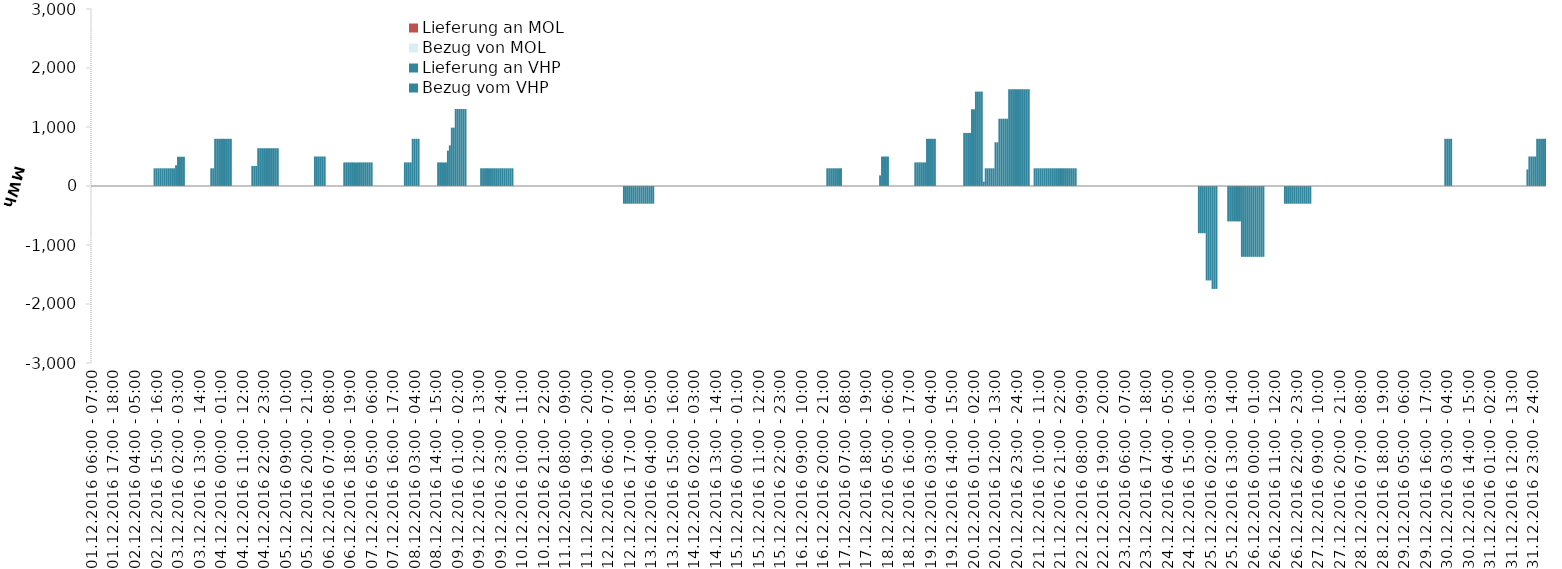
| Category | Bezug vom VHP | Lieferung an VHP | Bezug von MOL | Lieferung an MOL |
|---|---|---|---|---|
| 01.12.2016 06:00 - 07:00 | 0 | 0 | 0 | 0 |
| 01.12.2016 07:00 - 08:00 | 0 | 0 | 0 | 0 |
| 01.12.2016 08:00 - 09:00 | 0 | 0 | 0 | 0 |
| 01.12.2016 09:00 - 10:00 | 0 | 0 | 0 | 0 |
| 01.12.2016 10:00 - 11:00 | 0 | 0 | 0 | 0 |
| 01.12.2016 11:00 - 12:00 | 0 | 0 | 0 | 0 |
| 01.12.2016 12:00 - 13:00 | 0 | 0 | 0 | 0 |
| 01.12.2016 13:00 - 14:00 | 0 | 0 | 0 | 0 |
| 01.12.2016 14:00 - 15:00 | 0 | 0 | 0 | 0 |
| 01.12.2016 15:00 - 16:00 | 0 | 0 | 0 | 0 |
| 01.12.2016 16:00 - 17:00 | 0 | 0 | 0 | 0 |
| 01.12.2016 17:00 - 18:00 | 0 | 0 | 0 | 0 |
| 01.12.2016 18:00 - 19:00 | 0 | 0 | 0 | 0 |
| 01.12.2016 19:00 - 20:00 | 0 | 0 | 0 | 0 |
| 01.12.2016 20:00 - 21:00 | 0 | 0 | 0 | 0 |
| 01.12.2016 21:00 - 22:00 | 0 | 0 | 0 | 0 |
| 01.12.2016 22:00 - 23:00 | 0 | 0 | 0 | 0 |
| 01.12.2016 23:00 - 24:00 | 0 | 0 | 0 | 0 |
| 02.12.2016 00:00 - 01:00 | 0 | 0 | 0 | 0 |
| 02.12.2016 01:00 - 02:00 | 0 | 0 | 0 | 0 |
| 02.12.2016 02:00 - 03:00 | 0 | 0 | 0 | 0 |
| 02.12.2016 03:00 - 04:00 | 0 | 0 | 0 | 0 |
| 02.12.2016 04:00 - 05:00 | 0 | 0 | 0 | 0 |
| 02.12.2016 05:00 - 06:00 | 0 | 0 | 0 | 0 |
| 02.12.2016 06:00 - 07:00 | 0 | 0 | 0 | 0 |
| 02.12.2016 07:00 - 08:00 | 0 | 0 | 0 | 0 |
| 02.12.2016 08:00 - 09:00 | 0 | 0 | 0 | 0 |
| 02.12.2016 09:00 - 10:00 | 0 | 0 | 0 | 0 |
| 02.12.2016 10:00 - 11:00 | 0 | 0 | 0 | 0 |
| 02.12.2016 11:00 - 12:00 | 0 | 0 | 0 | 0 |
| 02.12.2016 12:00 - 13:00 | 0 | 0 | 0 | 0 |
| 02.12.2016 13:00 - 14:00 | 0 | 0 | 0 | 0 |
| 02.12.2016 14:00 - 15:00 | 300 | 0 | 0 | 0 |
| 02.12.2016 15:00 - 16:00 | 300 | 0 | 0 | 0 |
| 02.12.2016 16:00 - 17:00 | 300 | 0 | 0 | 0 |
| 02.12.2016 17:00 - 18:00 | 300 | 0 | 0 | 0 |
| 02.12.2016 18:00 - 19:00 | 300 | 0 | 0 | 0 |
| 02.12.2016 19:00 - 20:00 | 300 | 0 | 0 | 0 |
| 02.12.2016 20:00 - 21:00 | 300 | 0 | 0 | 0 |
| 02.12.2016 21:00 - 22:00 | 300 | 0 | 0 | 0 |
| 02.12.2016 22:00 - 23:00 | 300 | 0 | 0 | 0 |
| 02.12.2016 23:00 - 24:00 | 300 | 0 | 0 | 0 |
| 03.12.2016 00:00 - 01:00 | 300 | 0 | 0 | 0 |
| 03.12.2016 01:00 - 02:00 | 352 | 0 | 0 | 0 |
| 03.12.2016 02:00 - 03:00 | 496 | 0 | 0 | 0 |
| 03.12.2016 03:00 - 04:00 | 496 | 0 | 0 | 0 |
| 03.12.2016 04:00 - 05:00 | 496 | 0 | 0 | 0 |
| 03.12.2016 05:00 - 06:00 | 496 | 0 | 0 | 0 |
| 03.12.2016 06:00 - 07:00 | 0 | 0 | 0 | 0 |
| 03.12.2016 07:00 - 08:00 | 0 | 0 | 0 | 0 |
| 03.12.2016 08:00 - 09:00 | 0 | 0 | 0 | 0 |
| 03.12.2016 09:00 - 10:00 | 0 | 0 | 0 | 0 |
| 03.12.2016 10:00 - 11:00 | 0 | 0 | 0 | 0 |
| 03.12.2016 11:00 - 12:00 | 0 | 0 | 0 | 0 |
| 03.12.2016 12:00 - 13:00 | 0 | 0 | 0 | 0 |
| 03.12.2016 13:00 - 14:00 | 0 | 0 | 0 | 0 |
| 03.12.2016 14:00 - 15:00 | 0 | 0 | 0 | 0 |
| 03.12.2016 15:00 - 16:00 | 0 | 0 | 0 | 0 |
| 03.12.2016 16:00 - 17:00 | 0 | 0 | 0 | 0 |
| 03.12.2016 17:00 - 18:00 | 0 | 0 | 0 | 0 |
| 03.12.2016 18:00 - 19:00 | 0 | 0 | 0 | 0 |
| 03.12.2016 19:00 - 20:00 | 300 | 0 | 0 | 0 |
| 03.12.2016 20:00 - 21:00 | 300 | 0 | 0 | 0 |
| 03.12.2016 21:00 - 22:00 | 800 | 0 | 0 | 0 |
| 03.12.2016 22:00 - 23:00 | 800 | 0 | 0 | 0 |
| 03.12.2016 23:00 - 24:00 | 800 | 0 | 0 | 0 |
| 04.12.2016 00:00 - 01:00 | 800 | 0 | 0 | 0 |
| 04.12.2016 01:00 - 02:00 | 800 | 0 | 0 | 0 |
| 04.12.2016 02:00 - 03:00 | 800 | 0 | 0 | 0 |
| 04.12.2016 03:00 - 04:00 | 800 | 0 | 0 | 0 |
| 04.12.2016 04:00 - 05:00 | 800 | 0 | 0 | 0 |
| 04.12.2016 05:00 - 06:00 | 800 | 0 | 0 | 0 |
| 04.12.2016 06:00 - 07:00 | 0 | 0 | 0 | 0 |
| 04.12.2016 07:00 - 08:00 | 0 | 0 | 0 | 0 |
| 04.12.2016 08:00 - 09:00 | 0 | 0 | 0 | 0 |
| 04.12.2016 09:00 - 10:00 | 0 | 0 | 0 | 0 |
| 04.12.2016 10:00 - 11:00 | 0 | 0 | 0 | 0 |
| 04.12.2016 11:00 - 12:00 | 0 | 0 | 0 | 0 |
| 04.12.2016 12:00 - 13:00 | 0 | 0 | 0 | 0 |
| 04.12.2016 13:00 - 14:00 | 0 | 0 | 0 | 0 |
| 04.12.2016 14:00 - 15:00 | 0 | 0 | 0 | 0 |
| 04.12.2016 15:00 - 16:00 | 0 | 0 | 0 | 0 |
| 04.12.2016 16:00 - 17:00 | 340 | 0 | 0 | 0 |
| 04.12.2016 17:00 - 18:00 | 340 | 0 | 0 | 0 |
| 04.12.2016 18:00 - 19:00 | 340 | 0 | 0 | 0 |
| 04.12.2016 19:00 - 20:00 | 640 | 0 | 0 | 0 |
| 04.12.2016 20:00 - 21:00 | 640 | 0 | 0 | 0 |
| 04.12.2016 21:00 - 22:00 | 640 | 0 | 0 | 0 |
| 04.12.2016 22:00 - 23:00 | 640 | 0 | 0 | 0 |
| 04.12.2016 23:00 - 24:00 | 640 | 0 | 0 | 0 |
| 05.12.2016 00:00 - 01:00 | 640 | 0 | 0 | 0 |
| 05.12.2016 01:00 - 02:00 | 640 | 0 | 0 | 0 |
| 05.12.2016 02:00 - 03:00 | 640 | 0 | 0 | 0 |
| 05.12.2016 03:00 - 04:00 | 640 | 0 | 0 | 0 |
| 05.12.2016 04:00 - 05:00 | 640 | 0 | 0 | 0 |
| 05.12.2016 05:00 - 06:00 | 640 | 0 | 0 | 0 |
| 05.12.2016 06:00 - 07:00 | 0 | 0 | 0 | 0 |
| 05.12.2016 07:00 - 08:00 | 0 | 0 | 0 | 0 |
| 05.12.2016 08:00 - 09:00 | 0 | 0 | 0 | 0 |
| 05.12.2016 09:00 - 10:00 | 0 | 0 | 0 | 0 |
| 05.12.2016 10:00 - 11:00 | 0 | 0 | 0 | 0 |
| 05.12.2016 11:00 - 12:00 | 0 | 0 | 0 | 0 |
| 05.12.2016 12:00 - 13:00 | 0 | 0 | 0 | 0 |
| 05.12.2016 13:00 - 14:00 | 0 | 0 | 0 | 0 |
| 05.12.2016 14:00 - 15:00 | 0 | 0 | 0 | 0 |
| 05.12.2016 15:00 - 16:00 | 0 | 0 | 0 | 0 |
| 05.12.2016 16:00 - 17:00 | 0 | 0 | 0 | 0 |
| 05.12.2016 17:00 - 18:00 | 0 | 0 | 0 | 0 |
| 05.12.2016 18:00 - 19:00 | 0 | 0 | 0 | 0 |
| 05.12.2016 19:00 - 20:00 | 0 | 0 | 0 | 0 |
| 05.12.2016 20:00 - 21:00 | 0 | 0 | 0 | 0 |
| 05.12.2016 21:00 - 22:00 | 0 | 0 | 0 | 0 |
| 05.12.2016 22:00 - 23:00 | 0 | 0 | 0 | 0 |
| 05.12.2016 23:00 - 24:00 | 0 | 0 | 0 | 0 |
| 06.12.2016 00:00 - 01:00 | 500 | 0 | 0 | 0 |
| 06.12.2016 01:00 - 02:00 | 500 | 0 | 0 | 0 |
| 06.12.2016 02:00 - 03:00 | 500 | 0 | 0 | 0 |
| 06.12.2016 03:00 - 04:00 | 500 | 0 | 0 | 0 |
| 06.12.2016 04:00 - 05:00 | 500 | 0 | 0 | 0 |
| 06.12.2016 05:00 - 06:00 | 500 | 0 | 0 | 0 |
| 06.12.2016 06:00 - 07:00 | 0 | 0 | 0 | 0 |
| 06.12.2016 07:00 - 08:00 | 0 | 0 | 0 | 0 |
| 06.12.2016 08:00 - 09:00 | 0 | 0 | 0 | 0 |
| 06.12.2016 09:00 - 10:00 | 0 | 0 | 0 | 0 |
| 06.12.2016 10:00 - 11:00 | 0 | 0 | 0 | 0 |
| 06.12.2016 11:00 - 12:00 | 0 | 0 | 0 | 0 |
| 06.12.2016 12:00 - 13:00 | 0 | 0 | 0 | 0 |
| 06.12.2016 13:00 - 14:00 | 0 | 0 | 0 | 0 |
| 06.12.2016 14:00 - 15:00 | 0 | 0 | 0 | 0 |
| 06.12.2016 15:00 - 16:00 | 400 | 0 | 0 | 0 |
| 06.12.2016 16:00 - 17:00 | 400 | 0 | 0 | 0 |
| 06.12.2016 17:00 - 18:00 | 400 | 0 | 0 | 0 |
| 06.12.2016 18:00 - 19:00 | 400 | 0 | 0 | 0 |
| 06.12.2016 19:00 - 20:00 | 400 | 0 | 0 | 0 |
| 06.12.2016 20:00 - 21:00 | 400 | 0 | 0 | 0 |
| 06.12.2016 21:00 - 22:00 | 400 | 0 | 0 | 0 |
| 06.12.2016 22:00 - 23:00 | 400 | 0 | 0 | 0 |
| 06.12.2016 23:00 - 24:00 | 400 | 0 | 0 | 0 |
| 07.12.2016 00:00 - 01:00 | 400 | 0 | 0 | 0 |
| 07.12.2016 01:00 - 02:00 | 400 | 0 | 0 | 0 |
| 07.12.2016 02:00 - 03:00 | 400 | 0 | 0 | 0 |
| 07.12.2016 03:00 - 04:00 | 400 | 0 | 0 | 0 |
| 07.12.2016 04:00 - 05:00 | 400 | 0 | 0 | 0 |
| 07.12.2016 05:00 - 06:00 | 400 | 0 | 0 | 0 |
| 07.12.2016 06:00 - 07:00 | 0 | 0 | 0 | 0 |
| 07.12.2016 07:00 - 08:00 | 0 | 0 | 0 | 0 |
| 07.12.2016 08:00 - 09:00 | 0 | 0 | 0 | 0 |
| 07.12.2016 09:00 - 10:00 | 0 | 0 | 0 | 0 |
| 07.12.2016 10:00 - 11:00 | 0 | 0 | 0 | 0 |
| 07.12.2016 11:00 - 12:00 | 0 | 0 | 0 | 0 |
| 07.12.2016 12:00 - 13:00 | 0 | 0 | 0 | 0 |
| 07.12.2016 13:00 - 14:00 | 0 | 0 | 0 | 0 |
| 07.12.2016 14:00 - 15:00 | 0 | 0 | 0 | 0 |
| 07.12.2016 15:00 - 16:00 | 0 | 0 | 0 | 0 |
| 07.12.2016 16:00 - 17:00 | 0 | 0 | 0 | 0 |
| 07.12.2016 17:00 - 18:00 | 0 | 0 | 0 | 0 |
| 07.12.2016 18:00 - 19:00 | 0 | 0 | 0 | 0 |
| 07.12.2016 19:00 - 20:00 | 0 | 0 | 0 | 0 |
| 07.12.2016 20:00 - 21:00 | 0 | 0 | 0 | 0 |
| 07.12.2016 21:00 - 22:00 | 0 | 0 | 0 | 0 |
| 07.12.2016 22:00 - 23:00 | 400 | 0 | 0 | 0 |
| 07.12.2016 23:00 - 24:00 | 400 | 0 | 0 | 0 |
| 08.12.2016 00:00 - 01:00 | 400 | 0 | 0 | 0 |
| 08.12.2016 01:00 - 02:00 | 400 | 0 | 0 | 0 |
| 08.12.2016 02:00 - 03:00 | 800 | 0 | 0 | 0 |
| 08.12.2016 03:00 - 04:00 | 800 | 0 | 0 | 0 |
| 08.12.2016 04:00 - 05:00 | 800 | 0 | 0 | 0 |
| 08.12.2016 05:00 - 06:00 | 800 | 0 | 0 | 0 |
| 08.12.2016 06:00 - 07:00 | 0 | 0 | 0 | 0 |
| 08.12.2016 07:00 - 08:00 | 0 | 0 | 0 | 0 |
| 08.12.2016 08:00 - 09:00 | 0 | 0 | 0 | 0 |
| 08.12.2016 09:00 - 10:00 | 0 | 0 | 0 | 0 |
| 08.12.2016 10:00 - 11:00 | 0 | 0 | 0 | 0 |
| 08.12.2016 11:00 - 12:00 | 0 | 0 | 0 | 0 |
| 08.12.2016 12:00 - 13:00 | 0 | 0 | 0 | 0 |
| 08.12.2016 13:00 - 14:00 | 0 | 0 | 0 | 0 |
| 08.12.2016 14:00 - 15:00 | 0 | 0 | 0 | 0 |
| 08.12.2016 15:00 - 16:00 | 400 | 0 | 0 | 0 |
| 08.12.2016 16:00 - 17:00 | 400 | 0 | 0 | 0 |
| 08.12.2016 17:00 - 18:00 | 400 | 0 | 0 | 0 |
| 08.12.2016 18:00 - 19:00 | 400 | 0 | 0 | 0 |
| 08.12.2016 19:00 - 20:00 | 400 | 0 | 0 | 0 |
| 08.12.2016 20:00 - 21:00 | 600 | 0 | 0 | 0 |
| 08.12.2016 21:00 - 22:00 | 689 | 0 | 0 | 0 |
| 08.12.2016 22:00 - 23:00 | 989 | 0 | 0 | 0 |
| 08.12.2016 23:00 - 24:00 | 989 | 0 | 0 | 0 |
| 09.12.2016 00:00 - 01:00 | 1306 | 0 | 0 | 0 |
| 09.12.2016 01:00 - 02:00 | 1306 | 0 | 0 | 0 |
| 09.12.2016 02:00 - 03:00 | 1306 | 0 | 0 | 0 |
| 09.12.2016 03:00 - 04:00 | 1306 | 0 | 0 | 0 |
| 09.12.2016 04:00 - 05:00 | 1306 | 0 | 0 | 0 |
| 09.12.2016 05:00 - 06:00 | 1306 | 0 | 0 | 0 |
| 09.12.2016 06:00 - 07:00 | 0 | 0 | 0 | 0 |
| 09.12.2016 07:00 - 08:00 | 0 | 0 | 0 | 0 |
| 09.12.2016 08:00 - 09:00 | 0 | 0 | 0 | 0 |
| 09.12.2016 09:00 - 10:00 | 0 | 0 | 0 | 0 |
| 09.12.2016 10:00 - 11:00 | 0 | 0 | 0 | 0 |
| 09.12.2016 11:00 - 12:00 | 0 | 0 | 0 | 0 |
| 09.12.2016 12:00 - 13:00 | 0 | 0 | 0 | 0 |
| 09.12.2016 13:00 - 14:00 | 300 | 0 | 0 | 0 |
| 09.12.2016 14:00 - 15:00 | 300 | 0 | 0 | 0 |
| 09.12.2016 15:00 - 16:00 | 300 | 0 | 0 | 0 |
| 09.12.2016 16:00 - 17:00 | 300 | 0 | 0 | 0 |
| 09.12.2016 17:00 - 18:00 | 300 | 0 | 0 | 0 |
| 09.12.2016 18:00 - 19:00 | 300 | 0 | 0 | 0 |
| 09.12.2016 19:00 - 20:00 | 300 | 0 | 0 | 0 |
| 09.12.2016 20:00 - 21:00 | 300 | 0 | 0 | 0 |
| 09.12.2016 21:00 - 22:00 | 300 | 0 | 0 | 0 |
| 09.12.2016 22:00 - 23:00 | 300 | 0 | 0 | 0 |
| 09.12.2016 23:00 - 24:00 | 300 | 0 | 0 | 0 |
| 10.12.2016 00:00 - 01:00 | 300 | 0 | 0 | 0 |
| 10.12.2016 01:00 - 02:00 | 300 | 0 | 0 | 0 |
| 10.12.2016 02:00 - 03:00 | 300 | 0 | 0 | 0 |
| 10.12.2016 03:00 - 04:00 | 300 | 0 | 0 | 0 |
| 10.12.2016 04:00 - 05:00 | 300 | 0 | 0 | 0 |
| 10.12.2016 05:00 - 06:00 | 300 | 0 | 0 | 0 |
| 10.12.2016 06:00 - 07:00 | 0 | 0 | 0 | 0 |
| 10.12.2016 07:00 - 08:00 | 0 | 0 | 0 | 0 |
| 10.12.2016 08:00 - 09:00 | 0 | 0 | 0 | 0 |
| 10.12.2016 09:00 - 10:00 | 0 | 0 | 0 | 0 |
| 10.12.2016 10:00 - 11:00 | 0 | 0 | 0 | 0 |
| 10.12.2016 11:00 - 12:00 | 0 | 0 | 0 | 0 |
| 10.12.2016 12:00 - 13:00 | 0 | 0 | 0 | 0 |
| 10.12.2016 13:00 - 14:00 | 0 | 0 | 0 | 0 |
| 10.12.2016 14:00 - 15:00 | 0 | 0 | 0 | 0 |
| 10.12.2016 15:00 - 16:00 | 0 | 0 | 0 | 0 |
| 10.12.2016 16:00 - 17:00 | 0 | 0 | 0 | 0 |
| 10.12.2016 17:00 - 18:00 | 0 | 0 | 0 | 0 |
| 10.12.2016 18:00 - 19:00 | 0 | 0 | 0 | 0 |
| 10.12.2016 19:00 - 20:00 | 0 | 0 | 0 | 0 |
| 10.12.2016 20:00 - 21:00 | 0 | 0 | 0 | 0 |
| 10.12.2016 21:00 - 22:00 | 0 | 0 | 0 | 0 |
| 10.12.2016 22:00 - 23:00 | 0 | 0 | 0 | 0 |
| 10.12.2016 23:00 - 24:00 | 0 | 0 | 0 | 0 |
| 11.12.2016 00:00 - 01:00 | 0 | 0 | 0 | 0 |
| 11.12.2016 01:00 - 02:00 | 0 | 0 | 0 | 0 |
| 11.12.2016 02:00 - 03:00 | 0 | 0 | 0 | 0 |
| 11.12.2016 03:00 - 04:00 | 0 | 0 | 0 | 0 |
| 11.12.2016 04:00 - 05:00 | 0 | 0 | 0 | 0 |
| 11.12.2016 05:00 - 06:00 | 0 | 0 | 0 | 0 |
| 11.12.2016 06:00 - 07:00 | 0 | 0 | 0 | 0 |
| 11.12.2016 07:00 - 08:00 | 0 | 0 | 0 | 0 |
| 11.12.2016 08:00 - 09:00 | 0 | 0 | 0 | 0 |
| 11.12.2016 09:00 - 10:00 | 0 | 0 | 0 | 0 |
| 11.12.2016 10:00 - 11:00 | 0 | 0 | 0 | 0 |
| 11.12.2016 11:00 - 12:00 | 0 | 0 | 0 | 0 |
| 11.12.2016 12:00 - 13:00 | 0 | 0 | 0 | 0 |
| 11.12.2016 13:00 - 14:00 | 0 | 0 | 0 | 0 |
| 11.12.2016 14:00 - 15:00 | 0 | 0 | 0 | 0 |
| 11.12.2016 15:00 - 16:00 | 0 | 0 | 0 | 0 |
| 11.12.2016 16:00 - 17:00 | 0 | 0 | 0 | 0 |
| 11.12.2016 17:00 - 18:00 | 0 | 0 | 0 | 0 |
| 11.12.2016 18:00 - 19:00 | 0 | 0 | 0 | 0 |
| 11.12.2016 19:00 - 20:00 | 0 | 0 | 0 | 0 |
| 11.12.2016 20:00 - 21:00 | 0 | 0 | 0 | 0 |
| 11.12.2016 21:00 - 22:00 | 0 | 0 | 0 | 0 |
| 11.12.2016 22:00 - 23:00 | 0 | 0 | 0 | 0 |
| 11.12.2016 23:00 - 24:00 | 0 | 0 | 0 | 0 |
| 12.12.2016 00:00 - 01:00 | 0 | 0 | 0 | 0 |
| 12.12.2016 01:00 - 02:00 | 0 | 0 | 0 | 0 |
| 12.12.2016 02:00 - 03:00 | 0 | 0 | 0 | 0 |
| 12.12.2016 03:00 - 04:00 | 0 | 0 | 0 | 0 |
| 12.12.2016 04:00 - 05:00 | 0 | 0 | 0 | 0 |
| 12.12.2016 05:00 - 06:00 | 0 | 0 | 0 | 0 |
| 12.12.2016 06:00 - 07:00 | 0 | 0 | 0 | 0 |
| 12.12.2016 07:00 - 08:00 | 0 | 0 | 0 | 0 |
| 12.12.2016 08:00 - 09:00 | 0 | 0 | 0 | 0 |
| 12.12.2016 09:00 - 10:00 | 0 | 0 | 0 | 0 |
| 12.12.2016 10:00 - 11:00 | 0 | 0 | 0 | 0 |
| 12.12.2016 11:00 - 12:00 | 0 | 0 | 0 | 0 |
| 12.12.2016 12:00 - 13:00 | 0 | 0 | 0 | 0 |
| 12.12.2016 13:00 - 14:00 | 0 | 0 | 0 | 0 |
| 12.12.2016 14:00 - 15:00 | 0 | -300 | 0 | 0 |
| 12.12.2016 15:00 - 16:00 | 0 | -300 | 0 | 0 |
| 12.12.2016 16:00 - 17:00 | 0 | -300 | 0 | 0 |
| 12.12.2016 17:00 - 18:00 | 0 | -300 | 0 | 0 |
| 12.12.2016 18:00 - 19:00 | 0 | -300 | 0 | 0 |
| 12.12.2016 19:00 - 20:00 | 0 | -300 | 0 | 0 |
| 12.12.2016 20:00 - 21:00 | 0 | -300 | 0 | 0 |
| 12.12.2016 21:00 - 22:00 | 0 | -300 | 0 | 0 |
| 12.12.2016 22:00 - 23:00 | 0 | -300 | 0 | 0 |
| 12.12.2016 23:00 - 24:00 | 0 | -300 | 0 | 0 |
| 13.12.2016 00:00 - 01:00 | 0 | -300 | 0 | 0 |
| 13.12.2016 01:00 - 02:00 | 0 | -300 | 0 | 0 |
| 13.12.2016 02:00 - 03:00 | 0 | -300 | 0 | 0 |
| 13.12.2016 03:00 - 04:00 | 0 | -300 | 0 | 0 |
| 13.12.2016 04:00 - 05:00 | 0 | -300 | 0 | 0 |
| 13.12.2016 05:00 - 06:00 | 0 | -300 | 0 | 0 |
| 13.12.2016 06:00 - 07:00 | 0 | 0 | 0 | 0 |
| 13.12.2016 07:00 - 08:00 | 0 | 0 | 0 | 0 |
| 13.12.2016 08:00 - 09:00 | 0 | 0 | 0 | 0 |
| 13.12.2016 09:00 - 10:00 | 0 | 0 | 0 | 0 |
| 13.12.2016 10:00 - 11:00 | 0 | 0 | 0 | 0 |
| 13.12.2016 11:00 - 12:00 | 0 | 0 | 0 | 0 |
| 13.12.2016 12:00 - 13:00 | 0 | 0 | 0 | 0 |
| 13.12.2016 13:00 - 14:00 | 0 | 0 | 0 | 0 |
| 13.12.2016 14:00 - 15:00 | 0 | 0 | 0 | 0 |
| 13.12.2016 15:00 - 16:00 | 0 | 0 | 0 | 0 |
| 13.12.2016 16:00 - 17:00 | 0 | 0 | 0 | 0 |
| 13.12.2016 17:00 - 18:00 | 0 | 0 | 0 | 0 |
| 13.12.2016 18:00 - 19:00 | 0 | 0 | 0 | 0 |
| 13.12.2016 19:00 - 20:00 | 0 | 0 | 0 | 0 |
| 13.12.2016 20:00 - 21:00 | 0 | 0 | 0 | 0 |
| 13.12.2016 21:00 - 22:00 | 0 | 0 | 0 | 0 |
| 13.12.2016 22:00 - 23:00 | 0 | 0 | 0 | 0 |
| 13.12.2016 23:00 - 24:00 | 0 | 0 | 0 | 0 |
| 14.12.2016 00:00 - 01:00 | 0 | 0 | 0 | 0 |
| 14.12.2016 01:00 - 02:00 | 0 | 0 | 0 | 0 |
| 14.12.2016 02:00 - 03:00 | 0 | 0 | 0 | 0 |
| 14.12.2016 03:00 - 04:00 | 0 | 0 | 0 | 0 |
| 14.12.2016 04:00 - 05:00 | 0 | 0 | 0 | 0 |
| 14.12.2016 05:00 - 06:00 | 0 | 0 | 0 | 0 |
| 14.12.2016 06:00 - 07:00 | 0 | 0 | 0 | 0 |
| 14.12.2016 07:00 - 08:00 | 0 | 0 | 0 | 0 |
| 14.12.2016 08:00 - 09:00 | 0 | 0 | 0 | 0 |
| 14.12.2016 09:00 - 10:00 | 0 | 0 | 0 | 0 |
| 14.12.2016 10:00 - 11:00 | 0 | 0 | 0 | 0 |
| 14.12.2016 11:00 - 12:00 | 0 | 0 | 0 | 0 |
| 14.12.2016 12:00 - 13:00 | 0 | 0 | 0 | 0 |
| 14.12.2016 13:00 - 14:00 | 0 | 0 | 0 | 0 |
| 14.12.2016 14:00 - 15:00 | 0 | 0 | 0 | 0 |
| 14.12.2016 15:00 - 16:00 | 0 | 0 | 0 | 0 |
| 14.12.2016 16:00 - 17:00 | 0 | 0 | 0 | 0 |
| 14.12.2016 17:00 - 18:00 | 0 | 0 | 0 | 0 |
| 14.12.2016 18:00 - 19:00 | 0 | 0 | 0 | 0 |
| 14.12.2016 19:00 - 20:00 | 0 | 0 | 0 | 0 |
| 14.12.2016 20:00 - 21:00 | 0 | 0 | 0 | 0 |
| 14.12.2016 21:00 - 22:00 | 0 | 0 | 0 | 0 |
| 14.12.2016 22:00 - 23:00 | 0 | 0 | 0 | 0 |
| 14.12.2016 23:00 - 24:00 | 0 | 0 | 0 | 0 |
| 15.12.2016 00:00 - 01:00 | 0 | 0 | 0 | 0 |
| 15.12.2016 01:00 - 02:00 | 0 | 0 | 0 | 0 |
| 15.12.2016 02:00 - 03:00 | 0 | 0 | 0 | 0 |
| 15.12.2016 03:00 - 04:00 | 0 | 0 | 0 | 0 |
| 15.12.2016 04:00 - 05:00 | 0 | 0 | 0 | 0 |
| 15.12.2016 05:00 - 06:00 | 0 | 0 | 0 | 0 |
| 15.12.2016 06:00 - 07:00 | 0 | 0 | 0 | 0 |
| 15.12.2016 07:00 - 08:00 | 0 | 0 | 0 | 0 |
| 15.12.2016 08:00 - 09:00 | 0 | 0 | 0 | 0 |
| 15.12.2016 09:00 - 10:00 | 0 | 0 | 0 | 0 |
| 15.12.2016 10:00 - 11:00 | 0 | 0 | 0 | 0 |
| 15.12.2016 11:00 - 12:00 | 0 | 0 | 0 | 0 |
| 15.12.2016 12:00 - 13:00 | 0 | 0 | 0 | 0 |
| 15.12.2016 13:00 - 14:00 | 0 | 0 | 0 | 0 |
| 15.12.2016 14:00 - 15:00 | 0 | 0 | 0 | 0 |
| 15.12.2016 15:00 - 16:00 | 0 | 0 | 0 | 0 |
| 15.12.2016 16:00 - 17:00 | 0 | 0 | 0 | 0 |
| 15.12.2016 17:00 - 18:00 | 0 | 0 | 0 | 0 |
| 15.12.2016 18:00 - 19:00 | 0 | 0 | 0 | 0 |
| 15.12.2016 19:00 - 20:00 | 0 | 0 | 0 | 0 |
| 15.12.2016 20:00 - 21:00 | 0 | 0 | 0 | 0 |
| 15.12.2016 21:00 - 22:00 | 0 | 0 | 0 | 0 |
| 15.12.2016 22:00 - 23:00 | 0 | 0 | 0 | 0 |
| 15.12.2016 23:00 - 24:00 | 0 | 0 | 0 | 0 |
| 16.12.2016 00:00 - 01:00 | 0 | 0 | 0 | 0 |
| 16.12.2016 01:00 - 02:00 | 0 | 0 | 0 | 0 |
| 16.12.2016 02:00 - 03:00 | 0 | 0 | 0 | 0 |
| 16.12.2016 03:00 - 04:00 | 0 | 0 | 0 | 0 |
| 16.12.2016 04:00 - 05:00 | 0 | 0 | 0 | 0 |
| 16.12.2016 05:00 - 06:00 | 0 | 0 | 0 | 0 |
| 16.12.2016 06:00 - 07:00 | 0 | 0 | 0 | 0 |
| 16.12.2016 07:00 - 08:00 | 0 | 0 | 0 | 0 |
| 16.12.2016 08:00 - 09:00 | 0 | 0 | 0 | 0 |
| 16.12.2016 09:00 - 10:00 | 0 | 0 | 0 | 0 |
| 16.12.2016 10:00 - 11:00 | 0 | 0 | 0 | 0 |
| 16.12.2016 11:00 - 12:00 | 0 | 0 | 0 | 0 |
| 16.12.2016 12:00 - 13:00 | 0 | 0 | 0 | 0 |
| 16.12.2016 13:00 - 14:00 | 0 | 0 | 0 | 0 |
| 16.12.2016 14:00 - 15:00 | 0 | 0 | 0 | 0 |
| 16.12.2016 15:00 - 16:00 | 0 | 0 | 0 | 0 |
| 16.12.2016 16:00 - 17:00 | 0 | 0 | 0 | 0 |
| 16.12.2016 17:00 - 18:00 | 0 | 0 | 0 | 0 |
| 16.12.2016 18:00 - 19:00 | 0 | 0 | 0 | 0 |
| 16.12.2016 19:00 - 20:00 | 0 | 0 | 0 | 0 |
| 16.12.2016 20:00 - 21:00 | 0 | 0 | 0 | 0 |
| 16.12.2016 21:00 - 22:00 | 0 | 0 | 0 | 0 |
| 16.12.2016 22:00 - 23:00 | 300 | 0 | 0 | 0 |
| 16.12.2016 23:00 - 24:00 | 300 | 0 | 0 | 0 |
| 17.12.2016 00:00 - 01:00 | 300 | 0 | 0 | 0 |
| 17.12.2016 01:00 - 02:00 | 300 | 0 | 0 | 0 |
| 17.12.2016 02:00 - 03:00 | 300 | 0 | 0 | 0 |
| 17.12.2016 03:00 - 04:00 | 300 | 0 | 0 | 0 |
| 17.12.2016 04:00 - 05:00 | 300 | 0 | 0 | 0 |
| 17.12.2016 05:00 - 06:00 | 300 | 0 | 0 | 0 |
| 17.12.2016 06:00 - 07:00 | 0 | 0 | 0 | 0 |
| 17.12.2016 07:00 - 08:00 | 0 | 0 | 0 | 0 |
| 17.12.2016 08:00 - 09:00 | 0 | 0 | 0 | 0 |
| 17.12.2016 09:00 - 10:00 | 0 | 0 | 0 | 0 |
| 17.12.2016 10:00 - 11:00 | 0 | 0 | 0 | 0 |
| 17.12.2016 11:00 - 12:00 | 0 | 0 | 0 | 0 |
| 17.12.2016 12:00 - 13:00 | 0 | 0 | 0 | 0 |
| 17.12.2016 13:00 - 14:00 | 0 | 0 | 0 | 0 |
| 17.12.2016 14:00 - 15:00 | 0 | 0 | 0 | 0 |
| 17.12.2016 15:00 - 16:00 | 0 | 0 | 0 | 0 |
| 17.12.2016 16:00 - 17:00 | 0 | 0 | 0 | 0 |
| 17.12.2016 17:00 - 18:00 | 0 | 0 | 0 | 0 |
| 17.12.2016 18:00 - 19:00 | 0 | 0 | 0 | 0 |
| 17.12.2016 19:00 - 20:00 | 0 | 0 | 0 | 0 |
| 17.12.2016 20:00 - 21:00 | 0 | 0 | 0 | 0 |
| 17.12.2016 21:00 - 22:00 | 0 | 0 | 0 | 0 |
| 17.12.2016 22:00 - 23:00 | 0 | 0 | 0 | 0 |
| 17.12.2016 23:00 - 24:00 | 0 | 0 | 0 | 0 |
| 18.12.2016 00:00 - 01:00 | 0 | 0 | 0 | 0 |
| 18.12.2016 01:00 - 02:00 | 180 | 0 | 0 | 0 |
| 18.12.2016 02:00 - 03:00 | 500 | 0 | 0 | 0 |
| 18.12.2016 03:00 - 04:00 | 500 | 0 | 0 | 0 |
| 18.12.2016 04:00 - 05:00 | 500 | 0 | 0 | 0 |
| 18.12.2016 05:00 - 06:00 | 500 | 0 | 0 | 0 |
| 18.12.2016 06:00 - 07:00 | 0 | 0 | 0 | 0 |
| 18.12.2016 07:00 - 08:00 | 0 | 0 | 0 | 0 |
| 18.12.2016 08:00 - 09:00 | 0 | 0 | 0 | 0 |
| 18.12.2016 09:00 - 10:00 | 0 | 0 | 0 | 0 |
| 18.12.2016 10:00 - 11:00 | 0 | 0 | 0 | 0 |
| 18.12.2016 11:00 - 12:00 | 0 | 0 | 0 | 0 |
| 18.12.2016 12:00 - 13:00 | 0 | 0 | 0 | 0 |
| 18.12.2016 13:00 - 14:00 | 0 | 0 | 0 | 0 |
| 18.12.2016 14:00 - 15:00 | 0 | 0 | 0 | 0 |
| 18.12.2016 15:00 - 16:00 | 0 | 0 | 0 | 0 |
| 18.12.2016 16:00 - 17:00 | 0 | 0 | 0 | 0 |
| 18.12.2016 17:00 - 18:00 | 0 | 0 | 0 | 0 |
| 18.12.2016 18:00 - 19:00 | 0 | 0 | 0 | 0 |
| 18.12.2016 19:00 - 20:00 | 400 | 0 | 0 | 0 |
| 18.12.2016 20:00 - 21:00 | 400 | 0 | 0 | 0 |
| 18.12.2016 21:00 - 22:00 | 400 | 0 | 0 | 0 |
| 18.12.2016 22:00 - 23:00 | 400 | 0 | 0 | 0 |
| 18.12.2016 23:00 - 24:00 | 400 | 0 | 0 | 0 |
| 19.12.2016 00:00 - 01:00 | 400 | 0 | 0 | 0 |
| 19.12.2016 01:00 - 02:00 | 800 | 0 | 0 | 0 |
| 19.12.2016 02:00 - 03:00 | 800 | 0 | 0 | 0 |
| 19.12.2016 03:00 - 04:00 | 800 | 0 | 0 | 0 |
| 19.12.2016 04:00 - 05:00 | 800 | 0 | 0 | 0 |
| 19.12.2016 05:00 - 06:00 | 800 | 0 | 0 | 0 |
| 19.12.2016 06:00 - 07:00 | 0 | 0 | 0 | 0 |
| 19.12.2016 07:00 - 08:00 | 0 | 0 | 0 | 0 |
| 19.12.2016 08:00 - 09:00 | 0 | 0 | 0 | 0 |
| 19.12.2016 09:00 - 10:00 | 0 | 0 | 0 | 0 |
| 19.12.2016 10:00 - 11:00 | 0 | 0 | 0 | 0 |
| 19.12.2016 11:00 - 12:00 | 0 | 0 | 0 | 0 |
| 19.12.2016 12:00 - 13:00 | 0 | 0 | 0 | 0 |
| 19.12.2016 13:00 - 14:00 | 0 | 0 | 0 | 0 |
| 19.12.2016 14:00 - 15:00 | 0 | 0 | 0 | 0 |
| 19.12.2016 15:00 - 16:00 | 0 | 0 | 0 | 0 |
| 19.12.2016 16:00 - 17:00 | 0 | 0 | 0 | 0 |
| 19.12.2016 17:00 - 18:00 | 0 | 0 | 0 | 0 |
| 19.12.2016 18:00 - 19:00 | 0 | 0 | 0 | 0 |
| 19.12.2016 19:00 - 20:00 | 0 | 0 | 0 | 0 |
| 19.12.2016 20:00 - 21:00 | 900 | 0 | 0 | 0 |
| 19.12.2016 21:00 - 22:00 | 900 | 0 | 0 | 0 |
| 19.12.2016 22:00 - 23:00 | 900 | 0 | 0 | 0 |
| 19.12.2016 23:00 - 24:00 | 900 | 0 | 0 | 0 |
| 20.12.2016 00:00 - 01:00 | 1300 | 0 | 0 | 0 |
| 20.12.2016 01:00 - 02:00 | 1300 | 0 | 0 | 0 |
| 20.12.2016 02:00 - 03:00 | 1600 | 0 | 0 | 0 |
| 20.12.2016 03:00 - 04:00 | 1600 | 0 | 0 | 0 |
| 20.12.2016 04:00 - 05:00 | 1600 | 0 | 0 | 0 |
| 20.12.2016 05:00 - 06:00 | 1600 | 0 | 0 | 0 |
| 20.12.2016 06:00 - 07:00 | 73 | 0 | 0 | 0 |
| 20.12.2016 07:00 - 08:00 | 300 | 0 | 0 | 0 |
| 20.12.2016 08:00 - 09:00 | 300 | 0 | 0 | 0 |
| 20.12.2016 09:00 - 10:00 | 300 | 0 | 0 | 0 |
| 20.12.2016 10:00 - 11:00 | 300 | 0 | 0 | 0 |
| 20.12.2016 11:00 - 12:00 | 300 | 0 | 0 | 0 |
| 20.12.2016 12:00 - 13:00 | 740 | 0 | 0 | 0 |
| 20.12.2016 13:00 - 14:00 | 740 | 0 | 0 | 0 |
| 20.12.2016 14:00 - 15:00 | 1140 | 0 | 0 | 0 |
| 20.12.2016 15:00 - 16:00 | 1140 | 0 | 0 | 0 |
| 20.12.2016 16:00 - 17:00 | 1140 | 0 | 0 | 0 |
| 20.12.2016 17:00 - 18:00 | 1140 | 0 | 0 | 0 |
| 20.12.2016 18:00 - 19:00 | 1140 | 0 | 0 | 0 |
| 20.12.2016 19:00 - 20:00 | 1640 | 0 | 0 | 0 |
| 20.12.2016 20:00 - 21:00 | 1640 | 0 | 0 | 0 |
| 20.12.2016 21:00 - 22:00 | 1640 | 0 | 0 | 0 |
| 20.12.2016 22:00 - 23:00 | 1640 | 0 | 0 | 0 |
| 20.12.2016 23:00 - 24:00 | 1640 | 0 | 0 | 0 |
| 21.12.2016 00:00 - 01:00 | 1640 | 0 | 0 | 0 |
| 21.12.2016 01:00 - 02:00 | 1640 | 0 | 0 | 0 |
| 21.12.2016 02:00 - 03:00 | 1640 | 0 | 0 | 0 |
| 21.12.2016 03:00 - 04:00 | 1640 | 0 | 0 | 0 |
| 21.12.2016 04:00 - 05:00 | 1640 | 0 | 0 | 0 |
| 21.12.2016 05:00 - 06:00 | 1640 | 0 | 0 | 0 |
| 21.12.2016 06:00 - 07:00 | 0 | 0 | 0 | 0 |
| 21.12.2016 07:00 - 08:00 | 0 | 0 | 0 | 0 |
| 21.12.2016 08:00 - 09:00 | 300 | 0 | 0 | 0 |
| 21.12.2016 09:00 - 10:00 | 300 | 0 | 0 | 0 |
| 21.12.2016 10:00 - 11:00 | 300 | 0 | 0 | 0 |
| 21.12.2016 11:00 - 12:00 | 300 | 0 | 0 | 0 |
| 21.12.2016 12:00 - 13:00 | 300 | 0 | 0 | 0 |
| 21.12.2016 13:00 - 14:00 | 300 | 0 | 0 | 0 |
| 21.12.2016 14:00 - 15:00 | 300 | 0 | 0 | 0 |
| 21.12.2016 15:00 - 16:00 | 300 | 0 | 0 | 0 |
| 21.12.2016 16:00 - 17:00 | 300 | 0 | 0 | 0 |
| 21.12.2016 17:00 - 18:00 | 300 | 0 | 0 | 0 |
| 21.12.2016 18:00 - 19:00 | 300 | 0 | 0 | 0 |
| 21.12.2016 19:00 - 20:00 | 300 | 0 | 0 | 0 |
| 21.12.2016 20:00 - 21:00 | 300 | 0 | 0 | 0 |
| 21.12.2016 21:00 - 22:00 | 300 | 0 | 0 | 0 |
| 21.12.2016 22:00 - 23:00 | 300 | 0 | 0 | 0 |
| 21.12.2016 23:00 - 24:00 | 300 | 0 | 0 | 0 |
| 22.12.2016 00:00 - 01:00 | 300 | 0 | 0 | 0 |
| 22.12.2016 01:00 - 02:00 | 300 | 0 | 0 | 0 |
| 22.12.2016 02:00 - 03:00 | 300 | 0 | 0 | 0 |
| 22.12.2016 03:00 - 04:00 | 300 | 0 | 0 | 0 |
| 22.12.2016 04:00 - 05:00 | 300 | 0 | 0 | 0 |
| 22.12.2016 05:00 - 06:00 | 300 | 0 | 0 | 0 |
| 22.12.2016 06:00 - 07:00 | 0 | 0 | 0 | 0 |
| 22.12.2016 07:00 - 08:00 | 0 | 0 | 0 | 0 |
| 22.12.2016 08:00 - 09:00 | 0 | 0 | 0 | 0 |
| 22.12.2016 09:00 - 10:00 | 0 | 0 | 0 | 0 |
| 22.12.2016 10:00 - 11:00 | 0 | 0 | 0 | 0 |
| 22.12.2016 11:00 - 12:00 | 0 | 0 | 0 | 0 |
| 22.12.2016 12:00 - 13:00 | 0 | 0 | 0 | 0 |
| 22.12.2016 13:00 - 14:00 | 0 | 0 | 0 | 0 |
| 22.12.2016 14:00 - 15:00 | 0 | 0 | 0 | 0 |
| 22.12.2016 15:00 - 16:00 | 0 | 0 | 0 | 0 |
| 22.12.2016 16:00 - 17:00 | 0 | 0 | 0 | 0 |
| 22.12.2016 17:00 - 18:00 | 0 | 0 | 0 | 0 |
| 22.12.2016 18:00 - 19:00 | 0 | 0 | 0 | 0 |
| 22.12.2016 19:00 - 20:00 | 0 | 0 | 0 | 0 |
| 22.12.2016 20:00 - 21:00 | 0 | 0 | 0 | 0 |
| 22.12.2016 21:00 - 22:00 | 0 | 0 | 0 | 0 |
| 22.12.2016 22:00 - 23:00 | 0 | 0 | 0 | 0 |
| 22.12.2016 23:00 - 24:00 | 0 | 0 | 0 | 0 |
| 23.12.2016 00:00 - 01:00 | 0 | 0 | 0 | 0 |
| 23.12.2016 01:00 - 02:00 | 0 | 0 | 0 | 0 |
| 23.12.2016 02:00 - 03:00 | 0 | 0 | 0 | 0 |
| 23.12.2016 03:00 - 04:00 | 0 | 0 | 0 | 0 |
| 23.12.2016 04:00 - 05:00 | 0 | 0 | 0 | 0 |
| 23.12.2016 05:00 - 06:00 | 0 | 0 | 0 | 0 |
| 23.12.2016 06:00 - 07:00 | 0 | 0 | 0 | 0 |
| 23.12.2016 07:00 - 08:00 | 0 | 0 | 0 | 0 |
| 23.12.2016 08:00 - 09:00 | 0 | 0 | 0 | 0 |
| 23.12.2016 09:00 - 10:00 | 0 | 0 | 0 | 0 |
| 23.12.2016 10:00 - 11:00 | 0 | 0 | 0 | 0 |
| 23.12.2016 11:00 - 12:00 | 0 | 0 | 0 | 0 |
| 23.12.2016 12:00 - 13:00 | 0 | 0 | 0 | 0 |
| 23.12.2016 13:00 - 14:00 | 0 | 0 | 0 | 0 |
| 23.12.2016 14:00 - 15:00 | 0 | 0 | 0 | 0 |
| 23.12.2016 15:00 - 16:00 | 0 | 0 | 0 | 0 |
| 23.12.2016 16:00 - 17:00 | 0 | 0 | 0 | 0 |
| 23.12.2016 17:00 - 18:00 | 0 | 0 | 0 | 0 |
| 23.12.2016 18:00 - 19:00 | 0 | 0 | 0 | 0 |
| 23.12.2016 19:00 - 20:00 | 0 | 0 | 0 | 0 |
| 23.12.2016 20:00 - 21:00 | 0 | 0 | 0 | 0 |
| 23.12.2016 21:00 - 22:00 | 0 | 0 | 0 | 0 |
| 23.12.2016 22:00 - 23:00 | 0 | 0 | 0 | 0 |
| 23.12.2016 23:00 - 24:00 | 0 | 0 | 0 | 0 |
| 24.12.2016 00:00 - 01:00 | 0 | 0 | 0 | 0 |
| 24.12.2016 01:00 - 02:00 | 0 | 0 | 0 | 0 |
| 24.12.2016 02:00 - 03:00 | 0 | 0 | 0 | 0 |
| 24.12.2016 03:00 - 04:00 | 0 | 0 | 0 | 0 |
| 24.12.2016 04:00 - 05:00 | 0 | 0 | 0 | 0 |
| 24.12.2016 05:00 - 06:00 | 0 | 0 | 0 | 0 |
| 24.12.2016 06:00 - 07:00 | 0 | 0 | 0 | 0 |
| 24.12.2016 07:00 - 08:00 | 0 | 0 | 0 | 0 |
| 24.12.2016 08:00 - 09:00 | 0 | 0 | 0 | 0 |
| 24.12.2016 09:00 - 10:00 | 0 | 0 | 0 | 0 |
| 24.12.2016 10:00 - 11:00 | 0 | 0 | 0 | 0 |
| 24.12.2016 11:00 - 12:00 | 0 | 0 | 0 | 0 |
| 24.12.2016 12:00 - 13:00 | 0 | 0 | 0 | 0 |
| 24.12.2016 13:00 - 14:00 | 0 | 0 | 0 | 0 |
| 24.12.2016 14:00 - 15:00 | 0 | 0 | 0 | 0 |
| 24.12.2016 15:00 - 16:00 | 0 | 0 | 0 | 0 |
| 24.12.2016 16:00 - 17:00 | 0 | 0 | 0 | 0 |
| 24.12.2016 17:00 - 18:00 | 0 | 0 | 0 | 0 |
| 24.12.2016 18:00 - 19:00 | 0 | 0 | 0 | 0 |
| 24.12.2016 19:00 - 20:00 | 0 | 0 | 0 | 0 |
| 24.12.2016 20:00 - 21:00 | 0 | -800 | 0 | 0 |
| 24.12.2016 21:00 - 22:00 | 0 | -800 | 0 | 0 |
| 24.12.2016 22:00 - 23:00 | 0 | -800 | 0 | 0 |
| 24.12.2016 23:00 - 24:00 | 0 | -800 | 0 | 0 |
| 25.12.2016 00:00 - 01:00 | 0 | -1600 | 0 | 0 |
| 25.12.2016 01:00 - 02:00 | 0 | -1600 | 0 | 0 |
| 25.12.2016 02:00 - 03:00 | 0 | -1600 | 0 | 0 |
| 25.12.2016 03:00 - 04:00 | 0 | -1744 | 0 | 0 |
| 25.12.2016 04:00 - 05:00 | 0 | -1744 | 0 | 0 |
| 25.12.2016 05:00 - 06:00 | 0 | -1744 | 0 | 0 |
| 25.12.2016 06:00 - 07:00 | 0 | 0 | 0 | 0 |
| 25.12.2016 07:00 - 08:00 | 0 | 0 | 0 | 0 |
| 25.12.2016 08:00 - 09:00 | 0 | 0 | 0 | 0 |
| 25.12.2016 09:00 - 10:00 | 0 | 0 | 0 | 0 |
| 25.12.2016 10:00 - 11:00 | 0 | 0 | 0 | 0 |
| 25.12.2016 11:00 - 12:00 | 0 | -600 | 0 | 0 |
| 25.12.2016 12:00 - 13:00 | 0 | -600 | 0 | 0 |
| 25.12.2016 13:00 - 14:00 | 0 | -600 | 0 | 0 |
| 25.12.2016 14:00 - 15:00 | 0 | -600 | 0 | 0 |
| 25.12.2016 15:00 - 16:00 | 0 | -600 | 0 | 0 |
| 25.12.2016 16:00 - 17:00 | 0 | -600 | 0 | 0 |
| 25.12.2016 17:00 - 18:00 | 0 | -600 | 0 | 0 |
| 25.12.2016 18:00 - 19:00 | 0 | -1200 | 0 | 0 |
| 25.12.2016 19:00 - 20:00 | 0 | -1200 | 0 | 0 |
| 25.12.2016 20:00 - 21:00 | 0 | -1200 | 0 | 0 |
| 25.12.2016 21:00 - 22:00 | 0 | -1200 | 0 | 0 |
| 25.12.2016 22:00 - 23:00 | 0 | -1200 | 0 | 0 |
| 25.12.2016 23:00 - 24:00 | 0 | -1200 | 0 | 0 |
| 26.12.2016 00:00 - 01:00 | 0 | -1200 | 0 | 0 |
| 26.12.2016 01:00 - 02:00 | 0 | -1200 | 0 | 0 |
| 26.12.2016 02:00 - 03:00 | 0 | -1200 | 0 | 0 |
| 26.12.2016 03:00 - 04:00 | 0 | -1200 | 0 | 0 |
| 26.12.2016 04:00 - 05:00 | 0 | -1200 | 0 | 0 |
| 26.12.2016 05:00 - 06:00 | 0 | -1200 | 0 | 0 |
| 26.12.2016 06:00 - 07:00 | 0 | 0 | 0 | 0 |
| 26.12.2016 07:00 - 08:00 | 0 | 0 | 0 | 0 |
| 26.12.2016 08:00 - 09:00 | 0 | 0 | 0 | 0 |
| 26.12.2016 09:00 - 10:00 | 0 | 0 | 0 | 0 |
| 26.12.2016 10:00 - 11:00 | 0 | 0 | 0 | 0 |
| 26.12.2016 11:00 - 12:00 | 0 | 0 | 0 | 0 |
| 26.12.2016 12:00 - 13:00 | 0 | 0 | 0 | 0 |
| 26.12.2016 13:00 - 14:00 | 0 | 0 | 0 | 0 |
| 26.12.2016 14:00 - 15:00 | 0 | 0 | 0 | 0 |
| 26.12.2016 15:00 - 16:00 | 0 | 0 | 0 | 0 |
| 26.12.2016 16:00 - 17:00 | 0 | -300 | 0 | 0 |
| 26.12.2016 17:00 - 18:00 | 0 | -300 | 0 | 0 |
| 26.12.2016 18:00 - 19:00 | 0 | -300 | 0 | 0 |
| 26.12.2016 19:00 - 20:00 | 0 | -300 | 0 | 0 |
| 26.12.2016 20:00 - 21:00 | 0 | -300 | 0 | 0 |
| 26.12.2016 21:00 - 22:00 | 0 | -300 | 0 | 0 |
| 26.12.2016 22:00 - 23:00 | 0 | -300 | 0 | 0 |
| 26.12.2016 23:00 - 24:00 | 0 | -300 | 0 | 0 |
| 27.12.2016 00:00 - 01:00 | 0 | -300 | 0 | 0 |
| 27.12.2016 01:00 - 02:00 | 0 | -300 | 0 | 0 |
| 27.12.2016 02:00 - 03:00 | 0 | -300 | 0 | 0 |
| 27.12.2016 03:00 - 04:00 | 0 | -300 | 0 | 0 |
| 27.12.2016 04:00 - 05:00 | 0 | -300 | 0 | 0 |
| 27.12.2016 05:00 - 06:00 | 0 | -300 | 0 | 0 |
| 27.12.2016 06:00 - 07:00 | 0 | 0 | 0 | 0 |
| 27.12.2016 07:00 - 08:00 | 0 | 0 | 0 | 0 |
| 27.12.2016 08:00 - 09:00 | 0 | 0 | 0 | 0 |
| 27.12.2016 09:00 - 10:00 | 0 | 0 | 0 | 0 |
| 27.12.2016 10:00 - 11:00 | 0 | 0 | 0 | 0 |
| 27.12.2016 11:00 - 12:00 | 0 | 0 | 0 | 0 |
| 27.12.2016 12:00 - 13:00 | 0 | 0 | 0 | 0 |
| 27.12.2016 13:00 - 14:00 | 0 | 0 | 0 | 0 |
| 27.12.2016 14:00 - 15:00 | 0 | 0 | 0 | 0 |
| 27.12.2016 15:00 - 16:00 | 0 | 0 | 0 | 0 |
| 27.12.2016 16:00 - 17:00 | 0 | 0 | 0 | 0 |
| 27.12.2016 17:00 - 18:00 | 0 | 0 | 0 | 0 |
| 27.12.2016 18:00 - 19:00 | 0 | 0 | 0 | 0 |
| 27.12.2016 19:00 - 20:00 | 0 | 0 | 0 | 0 |
| 27.12.2016 20:00 - 21:00 | 0 | 0 | 0 | 0 |
| 27.12.2016 21:00 - 22:00 | 0 | 0 | 0 | 0 |
| 27.12.2016 22:00 - 23:00 | 0 | 0 | 0 | 0 |
| 27.12.2016 23:00 - 24:00 | 0 | 0 | 0 | 0 |
| 28.12.2016 00:00 - 01:00 | 0 | 0 | 0 | 0 |
| 28.12.2016 01:00 - 02:00 | 0 | 0 | 0 | 0 |
| 28.12.2016 02:00 - 03:00 | 0 | 0 | 0 | 0 |
| 28.12.2016 03:00 - 04:00 | 0 | 0 | 0 | 0 |
| 28.12.2016 04:00 - 05:00 | 0 | 0 | 0 | 0 |
| 28.12.2016 05:00 - 06:00 | 0 | 0 | 0 | 0 |
| 28.12.2016 06:00 - 07:00 | 0 | 0 | 0 | 0 |
| 28.12.2016 07:00 - 08:00 | 0 | 0 | 0 | 0 |
| 28.12.2016 08:00 - 09:00 | 0 | 0 | 0 | 0 |
| 28.12.2016 09:00 - 10:00 | 0 | 0 | 0 | 0 |
| 28.12.2016 10:00 - 11:00 | 0 | 0 | 0 | 0 |
| 28.12.2016 11:00 - 12:00 | 0 | 0 | 0 | 0 |
| 28.12.2016 12:00 - 13:00 | 0 | 0 | 0 | 0 |
| 28.12.2016 13:00 - 14:00 | 0 | 0 | 0 | 0 |
| 28.12.2016 14:00 - 15:00 | 0 | 0 | 0 | 0 |
| 28.12.2016 15:00 - 16:00 | 0 | 0 | 0 | 0 |
| 28.12.2016 16:00 - 17:00 | 0 | 0 | 0 | 0 |
| 28.12.2016 17:00 - 18:00 | 0 | 0 | 0 | 0 |
| 28.12.2016 18:00 - 19:00 | 0 | 0 | 0 | 0 |
| 28.12.2016 19:00 - 20:00 | 0 | 0 | 0 | 0 |
| 28.12.2016 20:00 - 21:00 | 0 | 0 | 0 | 0 |
| 28.12.2016 21:00 - 22:00 | 0 | 0 | 0 | 0 |
| 28.12.2016 22:00 - 23:00 | 0 | 0 | 0 | 0 |
| 28.12.2016 23:00 - 24:00 | 0 | 0 | 0 | 0 |
| 29.12.2016 00:00 - 01:00 | 0 | 0 | 0 | 0 |
| 29.12.2016 01:00 - 02:00 | 0 | 0 | 0 | 0 |
| 29.12.2016 02:00 - 03:00 | 0 | 0 | 0 | 0 |
| 29.12.2016 03:00 - 04:00 | 0 | 0 | 0 | 0 |
| 29.12.2016 04:00 - 05:00 | 0 | 0 | 0 | 0 |
| 29.12.2016 05:00 - 06:00 | 0 | 0 | 0 | 0 |
| 29.12.2016 06:00 - 07:00 | 0 | 0 | 0 | 0 |
| 29.12.2016 07:00 - 08:00 | 0 | 0 | 0 | 0 |
| 29.12.2016 08:00 - 09:00 | 0 | 0 | 0 | 0 |
| 29.12.2016 09:00 - 10:00 | 0 | 0 | 0 | 0 |
| 29.12.2016 10:00 - 11:00 | 0 | 0 | 0 | 0 |
| 29.12.2016 11:00 - 12:00 | 0 | 0 | 0 | 0 |
| 29.12.2016 12:00 - 13:00 | 0 | 0 | 0 | 0 |
| 29.12.2016 13:00 - 14:00 | 0 | 0 | 0 | 0 |
| 29.12.2016 14:00 - 15:00 | 0 | 0 | 0 | 0 |
| 29.12.2016 15:00 - 16:00 | 0 | 0 | 0 | 0 |
| 29.12.2016 16:00 - 17:00 | 0 | 0 | 0 | 0 |
| 29.12.2016 17:00 - 18:00 | 0 | 0 | 0 | 0 |
| 29.12.2016 18:00 - 19:00 | 0 | 0 | 0 | 0 |
| 29.12.2016 19:00 - 20:00 | 0 | 0 | 0 | 0 |
| 29.12.2016 20:00 - 21:00 | 0 | 0 | 0 | 0 |
| 29.12.2016 21:00 - 22:00 | 0 | 0 | 0 | 0 |
| 29.12.2016 22:00 - 23:00 | 0 | 0 | 0 | 0 |
| 29.12.2016 23:00 - 24:00 | 0 | 0 | 0 | 0 |
| 30.12.2016 00:00 - 01:00 | 0 | 0 | 0 | 0 |
| 30.12.2016 01:00 - 02:00 | 0 | 0 | 0 | 0 |
| 30.12.2016 02:00 - 03:00 | 800 | 0 | 0 | 0 |
| 30.12.2016 03:00 - 04:00 | 800 | 0 | 0 | 0 |
| 30.12.2016 04:00 - 05:00 | 800 | 0 | 0 | 0 |
| 30.12.2016 05:00 - 06:00 | 800 | 0 | 0 | 0 |
| 30.12.2016 06:00 - 07:00 | 0 | 0 | 0 | 0 |
| 30.12.2016 07:00 - 08:00 | 0 | 0 | 0 | 0 |
| 30.12.2016 08:00 - 09:00 | 0 | 0 | 0 | 0 |
| 30.12.2016 09:00 - 10:00 | 0 | 0 | 0 | 0 |
| 30.12.2016 10:00 - 11:00 | 0 | 0 | 0 | 0 |
| 30.12.2016 11:00 - 12:00 | 0 | 0 | 0 | 0 |
| 30.12.2016 12:00 - 13:00 | 0 | 0 | 0 | 0 |
| 30.12.2016 13:00 - 14:00 | 0 | 0 | 0 | 0 |
| 30.12.2016 14:00 - 15:00 | 0 | 0 | 0 | 0 |
| 30.12.2016 15:00 - 16:00 | 0 | 0 | 0 | 0 |
| 30.12.2016 16:00 - 17:00 | 0 | 0 | 0 | 0 |
| 30.12.2016 17:00 - 18:00 | 0 | 0 | 0 | 0 |
| 30.12.2016 18:00 - 19:00 | 0 | 0 | 0 | 0 |
| 30.12.2016 19:00 - 20:00 | 0 | 0 | 0 | 0 |
| 30.12.2016 20:00 - 21:00 | 0 | 0 | 0 | 0 |
| 30.12.2016 21:00 - 22:00 | 0 | 0 | 0 | 0 |
| 30.12.2016 22:00 - 23:00 | 0 | 0 | 0 | 0 |
| 30.12.2016 23:00 - 24:00 | 0 | 0 | 0 | 0 |
| 31.12.2016 00:00 - 01:00 | 0 | 0 | 0 | 0 |
| 31.12.2016 01:00 - 02:00 | 0 | 0 | 0 | 0 |
| 31.12.2016 02:00 - 03:00 | 0 | 0 | 0 | 0 |
| 31.12.2016 03:00 - 04:00 | 0 | 0 | 0 | 0 |
| 31.12.2016 04:00 - 05:00 | 0 | 0 | 0 | 0 |
| 31.12.2016 05:00 - 06:00 | 0 | 0 | 0 | 0 |
| 31.12.2016 06:00 - 07:00 | 0 | 0 | 0 | 0 |
| 31.12.2016 07:00 - 08:00 | 0 | 0 | 0 | 0 |
| 31.12.2016 08:00 - 09:00 | 0 | 0 | 0 | 0 |
| 31.12.2016 09:00 - 10:00 | 0 | 0 | 0 | 0 |
| 31.12.2016 10:00 - 11:00 | 0 | 0 | 0 | 0 |
| 31.12.2016 11:00 - 12:00 | 0 | 0 | 0 | 0 |
| 31.12.2016 12:00 - 13:00 | 0 | 0 | 0 | 0 |
| 31.12.2016 13:00 - 14:00 | 0 | 0 | 0 | 0 |
| 31.12.2016 14:00 - 15:00 | 0 | 0 | 0 | 0 |
| 31.12.2016 15:00 - 16:00 | 0 | 0 | 0 | 0 |
| 31.12.2016 16:00 - 17:00 | 0 | 0 | 0 | 0 |
| 31.12.2016 17:00 - 18:00 | 0 | 0 | 0 | 0 |
| 31.12.2016 18:00 - 19:00 | 0 | 0 | 0 | 0 |
| 31.12.2016 19:00 - 20:00 | 0 | 0 | 0 | 0 |
| 31.12.2016 20:00 - 21:00 | 280 | 0 | 0 | 0 |
| 31.12.2016 21:00 - 22:00 | 500 | 0 | 0 | 0 |
| 31.12.2016 22:00 - 23:00 | 500 | 0 | 0 | 0 |
| 31.12.2016 23:00 - 24:00 | 500 | 0 | 0 | 0 |
| 01.01.2017 00:00 - 01:00 | 500 | 0 | 0 | 0 |
| 01.01.2017 01:00 - 02:00 | 800 | 0 | 0 | 0 |
| 01.01.2017 02:00 - 03:00 | 800 | 0 | 0 | 0 |
| 01.01.2017 03:00 - 04:00 | 800 | 0 | 0 | 0 |
| 01.01.2017 04:00 - 05:00 | 800 | 0 | 0 | 0 |
| 01.01.2017 05:00 - 06:00 | 800 | 0 | 0 | 0 |